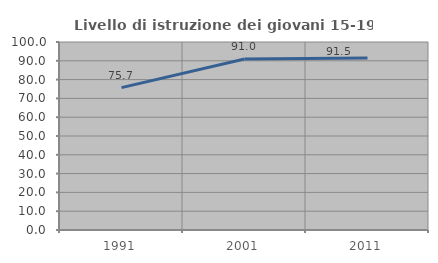
| Category | Livello di istruzione dei giovani 15-19 anni |
|---|---|
| 1991.0 | 75.744 |
| 2001.0 | 90.968 |
| 2011.0 | 91.46 |